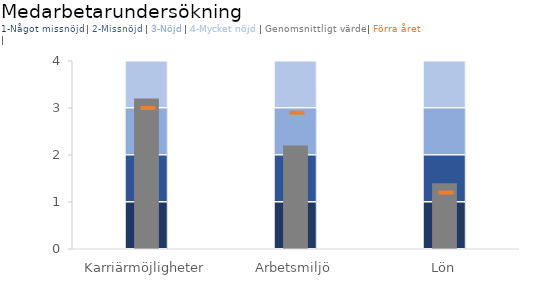
| Category | 1-Något missnöjd | 2-Missnöjd | 3-Nöjd | 4-Mycket nöjd |
|---|---|---|---|---|
| Karriärmöjligheter | 1 | 1 | 1 | 1 |
| Arbetsmiljö | 1 | 1 | 1 | 1 |
| Lön | 1 | 1 | 1 | 1 |